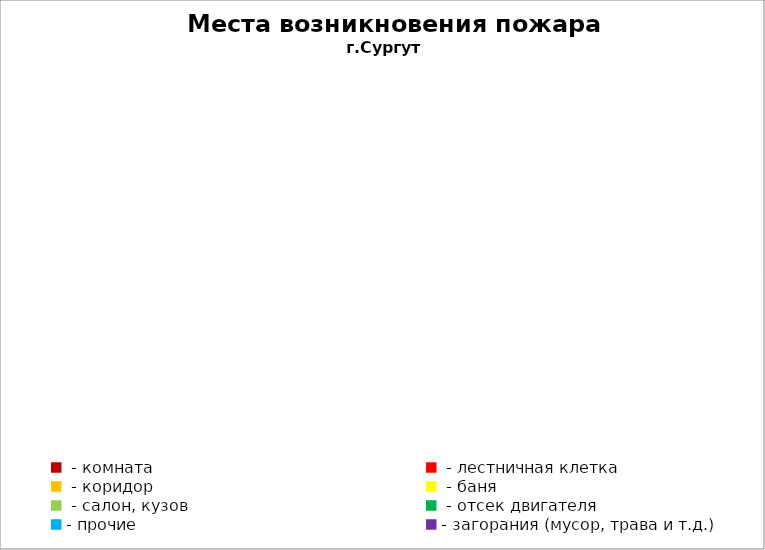
| Category | Места возникновения пожара |
|---|---|
|  - комната | 35 |
|  - лестничная клетка | 15 |
|  - коридор | 2 |
|  - баня | 16 |
|  - салон, кузов | 13 |
|  - отсек двигателя | 21 |
| - прочие | 50 |
| - загорания (мусор, трава и т.д.)  | 101 |